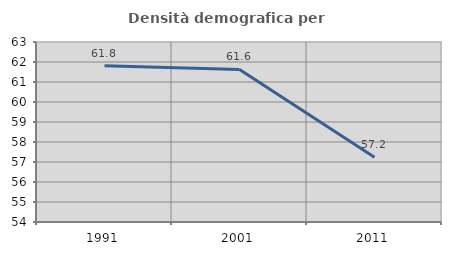
| Category | Densità demografica |
|---|---|
| 1991.0 | 61.818 |
| 2001.0 | 61.627 |
| 2011.0 | 57.234 |